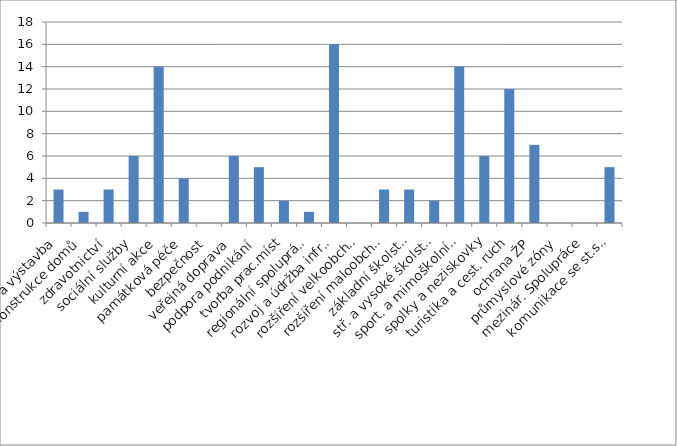
| Category | Series 0 |
|---|---|
| bytová výstavba | 3 |
| rekonstrukce domů | 1 |
| zdravotnictví | 3 |
| sociální služby | 6 |
| kulturní akce | 14 |
| památková péče | 4 |
| bezpečnost  | 0 |
| veřejná doprava | 6 |
| podpora podnikání | 5 |
| tvorba prac.míst | 2 |
| regionální spolupráce | 1 |
| rozvoj a údržba infrastruktury | 16 |
| rozšíření velkoobchodů | 0 |
| rozšíření maloobchodů | 3 |
| základní školství | 3 |
| stř. a vysoké školství | 2 |
| sport. a mimoškolní pro děti | 14 |
| spolky a neziskovky | 6 |
| turistika a cest. ruch | 12 |
| ochrana ŽP | 7 |
| průmyslové zóny | 0 |
| mezinár. Spolupráce | 0 |
| komunikace se st.spr. | 5 |